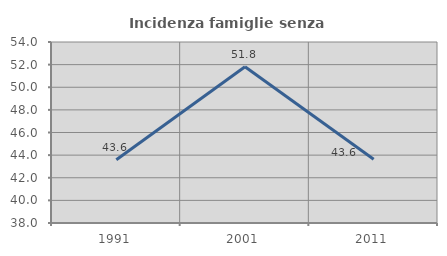
| Category | Incidenza famiglie senza nuclei |
|---|---|
| 1991.0 | 43.59 |
| 2001.0 | 51.818 |
| 2011.0 | 43.636 |